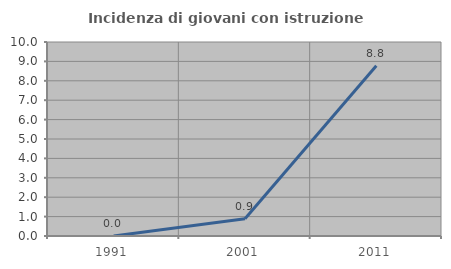
| Category | Incidenza di giovani con istruzione universitaria |
|---|---|
| 1991.0 | 0 |
| 2001.0 | 0.885 |
| 2011.0 | 8.772 |